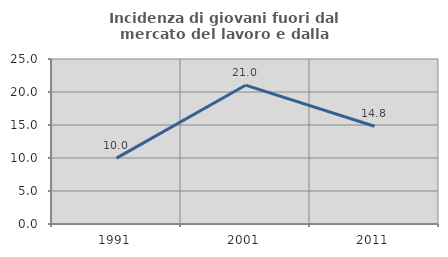
| Category | Incidenza di giovani fuori dal mercato del lavoro e dalla formazione  |
|---|---|
| 1991.0 | 9.981 |
| 2001.0 | 21.033 |
| 2011.0 | 14.815 |